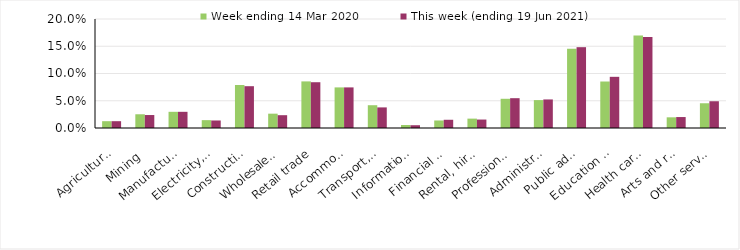
| Category | Week ending 14 Mar 2020 | This week (ending 19 Jun 2021) |
|---|---|---|
| Agriculture, forestry and fishing | 0.012 | 0.012 |
| Mining | 0.025 | 0.024 |
| Manufacturing | 0.03 | 0.03 |
| Electricity, gas, water and waste services | 0.014 | 0.014 |
| Construction | 0.079 | 0.077 |
| Wholesale trade | 0.026 | 0.024 |
| Retail trade | 0.086 | 0.084 |
| Accommodation and food services | 0.074 | 0.074 |
| Transport, postal and warehousing | 0.042 | 0.038 |
| Information media and telecommunications | 0.006 | 0.005 |
| Financial and insurance services | 0.014 | 0.015 |
| Rental, hiring and real estate services | 0.017 | 0.016 |
| Professional, scientific and technical services | 0.054 | 0.055 |
| Administrative and support services | 0.051 | 0.052 |
| Public administration and safety | 0.145 | 0.148 |
| Education and training | 0.085 | 0.094 |
| Health care and social assistance | 0.17 | 0.167 |
| Arts and recreation services | 0.02 | 0.02 |
| Other services | 0.045 | 0.049 |